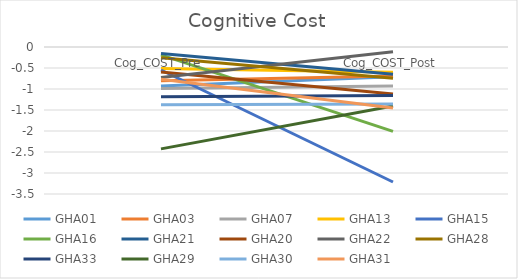
| Category | GHA01 | GHA03 | GHA07 | GHA13 | GHA15 | GHA16 | GHA21 | GHA20 | GHA22 | GHA28 | GHA33 | GHA29 | GHA30 | GHA31 |
|---|---|---|---|---|---|---|---|---|---|---|---|---|---|---|
| Cog_COST_Pre | -0.93 | -0.804 | -0.985 | -0.511 | -0.548 | -0.186 | -0.153 | -0.598 | -0.724 | -0.257 | -1.187 | -2.426 | -1.378 | -0.766 |
| Cog_COST_Post | -0.708 | -0.69 | -0.931 | -0.598 | -3.215 | -2.01 | -0.647 | -1.118 | -0.111 | -0.747 | -1.153 | -1.403 | -1.36 | -1.451 |